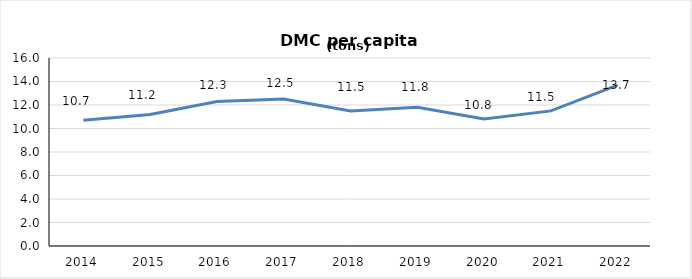
| Category | Series 0 |
|---|---|
| 2014.0 | 10.7 |
| 2015.0 | 11.2 |
| 2016.0 | 12.3 |
| 2017.0 | 12.5 |
| 2018.0 | 11.5 |
| 2019.0 | 11.8 |
| 2020.0 | 10.8 |
| 2021.0 | 11.5 |
| 2022.0 | 13.7 |